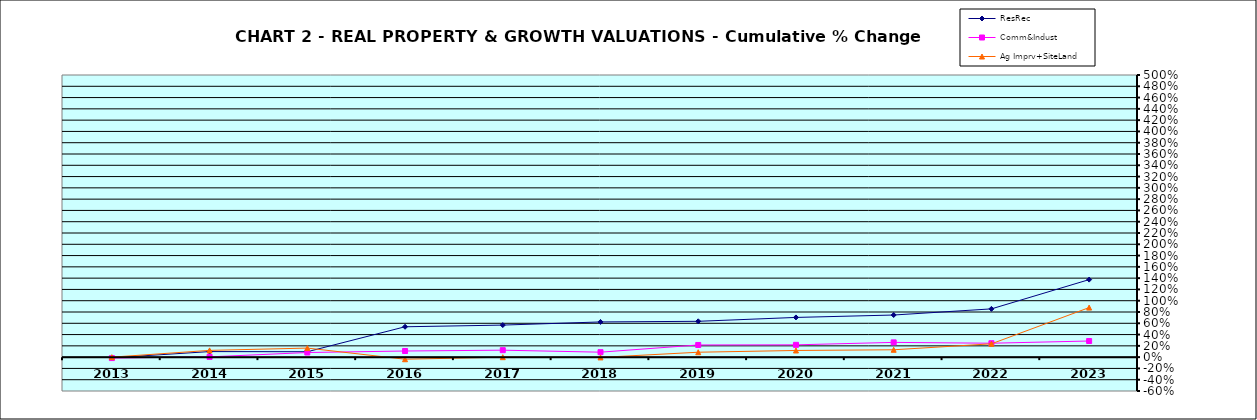
| Category | ResRec | Comm&Indust | Ag Imprv+SiteLand |
|---|---|---|---|
| 2013.0 | -0.011 | -0.016 | 0 |
| 2014.0 | 0.099 | 0.005 | 0.12 |
| 2015.0 | 0.096 | 0.082 | 0.161 |
| 2016.0 | 0.538 | 0.109 | -0.037 |
| 2017.0 | 0.568 | 0.123 | -0.001 |
| 2018.0 | 0.624 | 0.088 | -0.005 |
| 2019.0 | 0.635 | 0.216 | 0.087 |
| 2020.0 | 0.704 | 0.218 | 0.118 |
| 2021.0 | 0.746 | 0.262 | 0.131 |
| 2022.0 | 0.855 | 0.247 | 0.236 |
| 2023.0 | 1.374 | 0.286 | 0.878 |